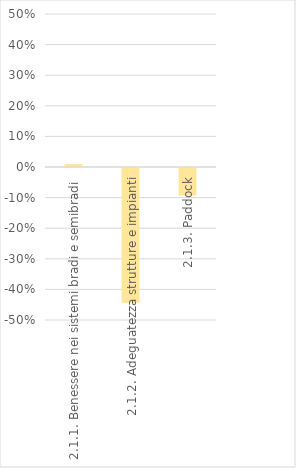
| Category | Series 0 |
|---|---|
| 2.1.1. Benessere nei sistemi bradi e semibradi | 0.01 |
| 2.1.2. Adeguatezza strutture e impianti | -0.44 |
| 2.1.3. Paddock | -0.09 |